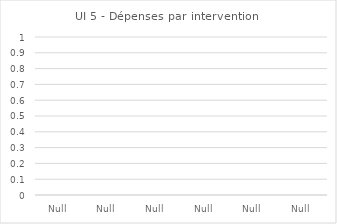
| Category | Travail rémunéré | Consommables | Coûts de réunion | Compensation pour coût d'opportunité | Actifs du projet | Services, impôts et autres coûts financiers | Contrats avec des tiers | Total benefits |
|---|---|---|---|---|---|---|---|---|
| Année 1 | 0 | 0 | 0 | 0 | 0 | 0 | 0 | 0 |
| Année 2 | 0 | 0 | 0 | 0 | 0 | 0 | 0 | 0 |
| Année 3 | 0 | 0 | 0 | 0 | 0 | 0 | 0 | 0 |
| Année 4 | 0 | 0 | 0 | 0 | 0 | 0 | 0 | 0 |
| Année 5 | 0 | 0 | 0 | 0 | 0 | 0 | 0 | 0 |
| Année 6 | 0 | 0 | 0 | 0 | 0 | 0 | 0 | 0 |
| Année 7 | 0 | 0 | 0 | 0 | 0 | 0 | 0 | 0 |
| Année 8 | 0 | 0 | 0 | 0 | 0 | 0 | 0 | 0 |
| Année 9 | 0 | 0 | 0 | 0 | 0 | 0 | 0 | 0 |
| Année 10 | 0 | 0 | 0 | 0 | 0 | 0 | 0 | 0 |
| Année 11 | 0 | 0 | 0 | 0 | 0 | 0 | 0 | 0 |
| Année 12 | 0 | 0 | 0 | 0 | 0 | 0 | 0 | 0 |
| Année 13 | 0 | 0 | 0 | 0 | 0 | 0 | 0 | 0 |
| Année 14 | 0 | 0 | 0 | 0 | 0 | 0 | 0 | 0 |
| Année 15 | 0 | 0 | 0 | 0 | 0 | 0 | 0 | 0 |
| Année 16 | 0 | 0 | 0 | 0 | 0 | 0 | 0 | 0 |
| Année 17 | 0 | 0 | 0 | 0 | 0 | 0 | 0 | 0 |
| Année 18 | 0 | 0 | 0 | 0 | 0 | 0 | 0 | 0 |
| Année 19 | 0 | 0 | 0 | 0 | 0 | 0 | 0 | 0 |
| Année 20 | 0 | 0 | 0 | 0 | 0 | 0 | 0 | 0 |
| Année 21 | 0 | 0 | 0 | 0 | 0 | 0 | 0 | 0 |
| Année 22 | 0 | 0 | 0 | 0 | 0 | 0 | 0 | 0 |
| Année 23 | 0 | 0 | 0 | 0 | 0 | 0 | 0 | 0 |
| Année 24 | 0 | 0 | 0 | 0 | 0 | 0 | 0 | 0 |
| Année 25 | 0 | 0 | 0 | 0 | 0 | 0 | 0 | 0 |
| Année 26 | 0 | 0 | 0 | 0 | 0 | 0 | 0 | 0 |
| Année 27 | 0 | 0 | 0 | 0 | 0 | 0 | 0 | 0 |
| Année 28 | 0 | 0 | 0 | 0 | 0 | 0 | 0 | 0 |
| Année 29 | 0 | 0 | 0 | 0 | 0 | 0 | 0 | 0 |
| Année 30 | 0 | 0 | 0 | 0 | 0 | 0 | 0 | 0 |
| Année 31 | 0 | 0 | 0 | 0 | 0 | 0 | 0 | 0 |
| Année 32 | 0 | 0 | 0 | 0 | 0 | 0 | 0 | 0 |
| Année 33 | 0 | 0 | 0 | 0 | 0 | 0 | 0 | 0 |
| Année 34 | 0 | 0 | 0 | 0 | 0 | 0 | 0 | 0 |
| Année 35 | 0 | 0 | 0 | 0 | 0 | 0 | 0 | 0 |